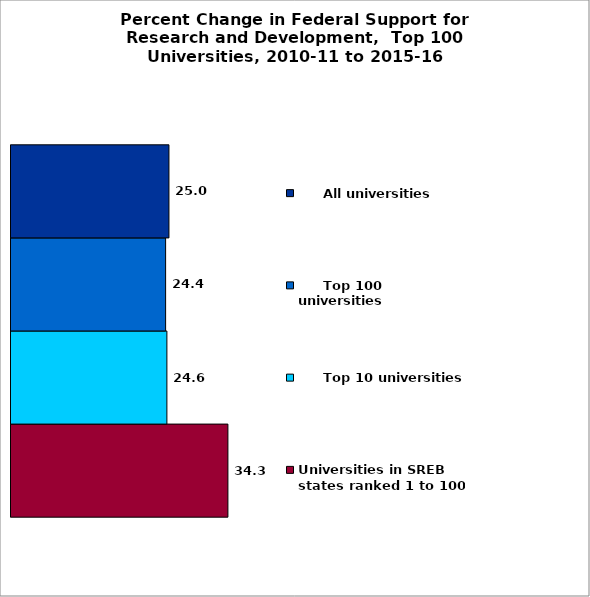
| Category | Universities in SREB states ranked 1 to 100 |      Top 10 universities |      Top 100 universities |      All universities |
|---|---|---|---|---|
| 0 | 34.294 | 24.648 | 24.446 | 24.973 |